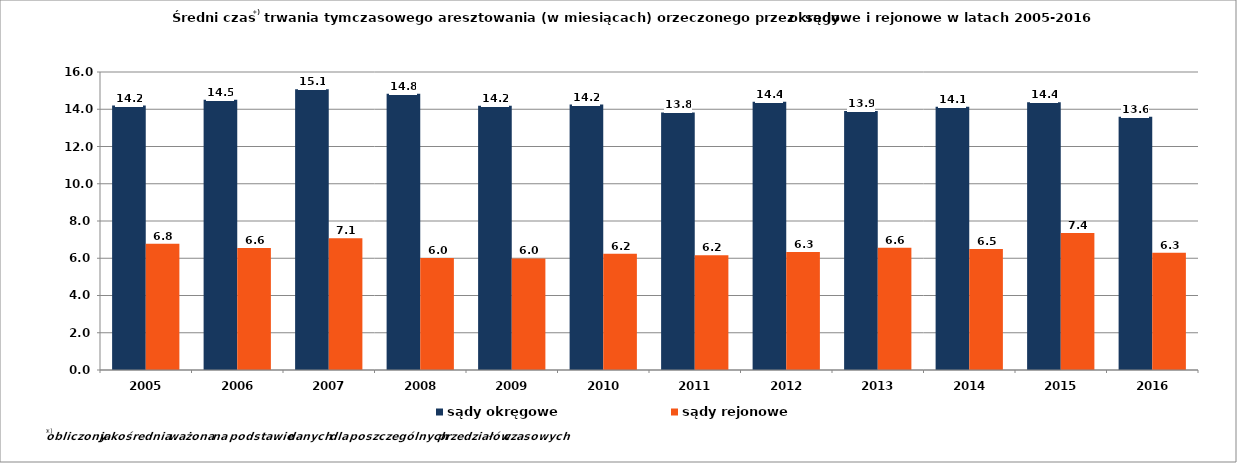
| Category | sądy okręgowe | sądy rejonowe |
|---|---|---|
| 2005.0 | 14.2 | 6.775 |
| 2006.0 | 14.512 | 6.555 |
| 2007.0 | 15.076 | 7.076 |
| 2008.0 | 14.836 | 6.01 |
| 2009.0 | 14.191 | 5.991 |
| 2010.0 | 14.25 | 6.24 |
| 2011.0 | 13.83 | 6.165 |
| 2012.0 | 14.406 | 6.335 |
| 2013.0 | 13.901 | 6.564 |
| 2014.0 | 14.132 | 6.496 |
| 2015.0 | 14.37 | 7.354 |
| 2016.0 | 13.6 | 6.3 |